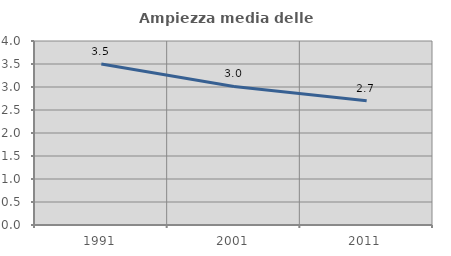
| Category | Ampiezza media delle famiglie |
|---|---|
| 1991.0 | 3.499 |
| 2001.0 | 3.011 |
| 2011.0 | 2.701 |